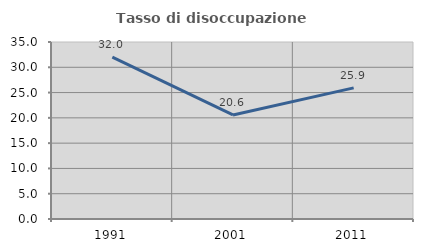
| Category | Tasso di disoccupazione giovanile  |
|---|---|
| 1991.0 | 32.012 |
| 2001.0 | 20.576 |
| 2011.0 | 25.927 |